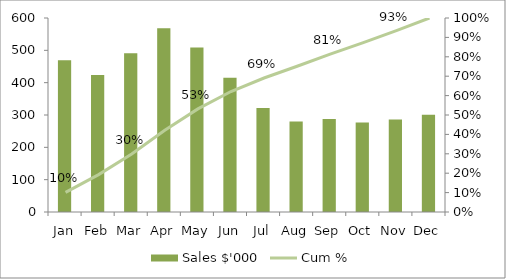
| Category | Sales $'000 |
|---|---|
| Jan | 469000 |
| Feb | 424000 |
| Mar | 491000 |
| Apr | 568000 |
| May | 509000 |
| Jun | 415000 |
| Jul | 322000 |
| Aug | 280000 |
| Sep | 288000 |
| Oct | 277000 |
| Nov | 286000 |
| Dec | 301000 |